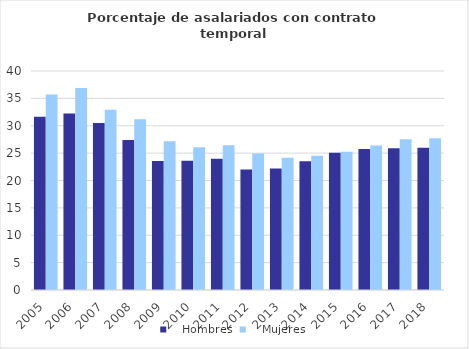
| Category |    Hombres |    Mujeres |
|---|---|---|
| 2005.0 | 31.656 | 35.695 |
| 2006.0 | 32.221 | 36.878 |
| 2007.0 | 30.501 | 32.924 |
| 2008.0 | 27.401 | 31.208 |
| 2009.0 | 23.55 | 27.15 |
| 2010.0 | 23.589 | 26.053 |
| 2011.0 | 23.957 | 26.455 |
| 2012.0 | 22.018 | 24.913 |
| 2013.0 | 22.204 | 24.14 |
| 2014.0 | 23.517 | 24.522 |
| 2015.0 | 25.055 | 25.235 |
| 2016.0 | 25.74 | 26.403 |
| 2017.0 | 25.876 | 27.532 |
| 2018.0 | 25.972 | 27.721 |